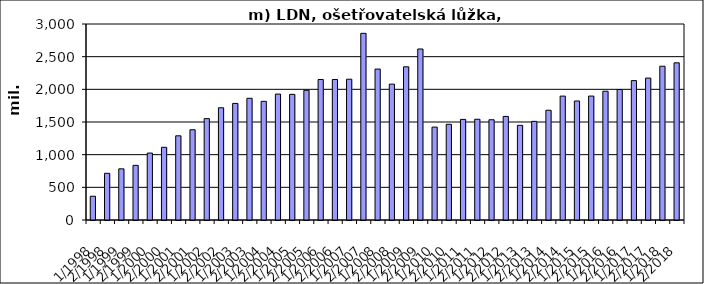
| Category | Series 0 |
|---|---|
| 1/1998 | 363613.373 |
| 2/1998 | 714767.259 |
| 1/1999 | 783152.218 |
| 2/1999 | 836471.782 |
| 1/2000 | 1024389.364 |
| 2/2000 | 1112928.256 |
| 1/2001 | 1288768 |
| 2/2001 | 1381582.387 |
| 1/2002 | 1551647 |
| 2/2002 | 1717923 |
| 1/2003 | 1784700 |
| 2/2003 | 1862878.059 |
| 1/2004 | 1816470.43 |
| 2/2004 | 1927264.939 |
| 1/2005 | 1923164 |
| 2/2005 | 1984841.03 |
| 1/2006 | 2150279 |
| 2/2006 | 2150563 |
| 1/2007 | 2154806 |
| 2/2007 | 2857057 |
| 1/2008 | 2310102.909 |
| 2/2008 | 2079592.091 |
| 1/2009 | 2344909.141 |
| 2/2009 | 2617438 |
| 1/2010 | 1421595 |
| 2/2010 | 1464808 |
| 1/2011 | 1539732 |
| 2/2011 | 1541898 |
| 1/2012 | 1534384 |
| 2/2012 | 1585581 |
| 1/2013 | 1448929 |
| 2/2013 | 1509989 |
| 1/2014 | 1679937 |
| 2/2014 | 1896443 |
| 1/2015 | 1821449 |
| 2/2015 | 1897121 |
| 1/2016 | 1970931 |
| 2/2016 | 1997398 |
| 1/2017 | 2133301 |
| 2/2017 | 2172280 |
| 1/2018 | 2353577.687 |
| 2/2018 | 2405930.716 |